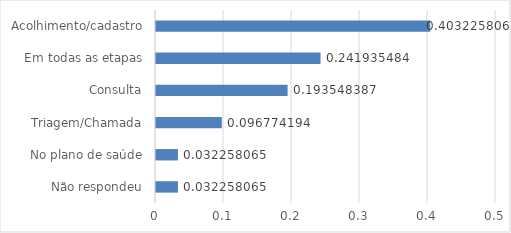
| Category | Series 0 |
|---|---|
| Não respondeu | 0.032 |
| No plano de saúde | 0.032 |
| Triagem/Chamada | 0.097 |
| Consulta | 0.194 |
| Em todas as etapas | 0.242 |
| Acolhimento/cadastro | 0.403 |